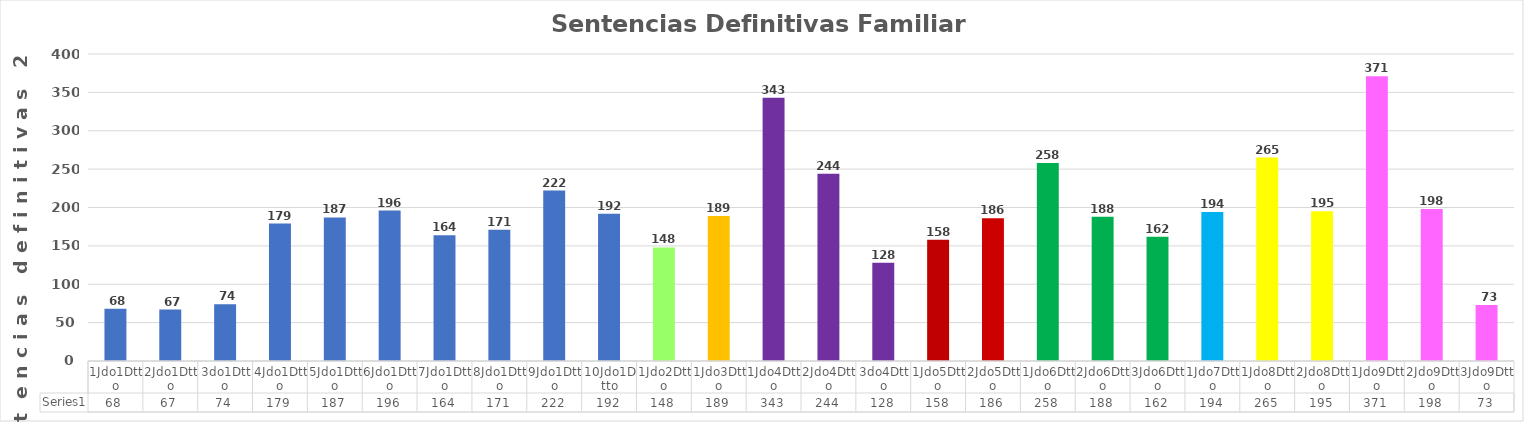
| Category | Series 0 |
|---|---|
| 1Jdo1Dtto | 68 |
| 2Jdo1Dtto | 67 |
| 3do1Dtto | 74 |
| 4Jdo1Dtto | 179 |
| 5Jdo1Dtto | 187 |
| 6Jdo1Dtto | 196 |
| 7Jdo1Dtto | 164 |
| 8Jdo1Dtto | 171 |
| 9Jdo1Dtto | 222 |
| 10Jdo1Dtto | 192 |
| 1Jdo2Dtto | 148 |
| 1Jdo3Dtto | 189 |
| 1Jdo4Dtto | 343 |
| 2Jdo4Dtto | 244 |
| 3do4Dtto | 128 |
| 1Jdo5Dtto | 158 |
| 2Jdo5Dtto | 186 |
| 1Jdo6Dtto | 258 |
| 2Jdo6Dtto | 188 |
| 3Jdo6Dtto | 162 |
| 1Jdo7Dtto | 194 |
| 1Jdo8Dtto | 265 |
| 2Jdo8Dtto | 195 |
| 1Jdo9Dtto | 371 |
| 2Jdo9Dtto | 198 |
| 3Jdo9Dtto | 73 |